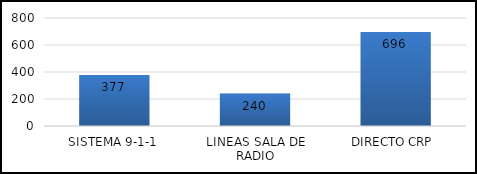
| Category | TOTAL |
|---|---|
| SISTEMA 9-1-1 | 377 |
| LINEAS SALA DE RADIO | 240 |
| DIRECTO CRP  | 696 |